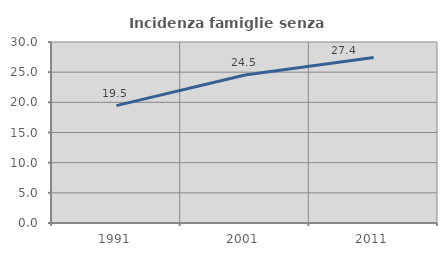
| Category | Incidenza famiglie senza nuclei |
|---|---|
| 1991.0 | 19.455 |
| 2001.0 | 24.542 |
| 2011.0 | 27.42 |